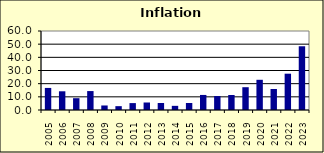
| Category | 26.7 |
|---|---|
| 2005.0 | 16.762 |
| 2006.0 | 14.21 |
| 2007.0 | 8.958 |
| 2008.0 | 14.381 |
| 2009.0 | 3.429 |
| 2010.0 | 2.921 |
| 2011.0 | 5.242 |
| 2012.0 | 5.699 |
| 2013.0 | 5.299 |
| 2014.0 | 3.155 |
| 2015.0 | 5.317 |
| 2016.0 | 11.435 |
| 2017.0 | 10.61 |
| 2018.0 | 11.416 |
| 2019.0 | 17.308 |
| 2020.0 | 22.945 |
| 2021.0 | 15.941 |
| 2022.0 | 27.576 |
| 2023.0 | 48.4 |